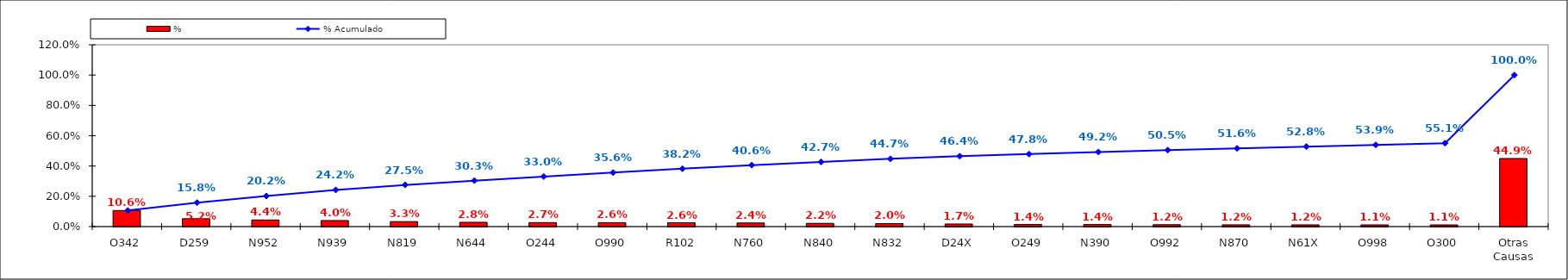
| Category | % |
|---|---|
| O342 | 0.106 |
| D259 | 0.052 |
| N952 | 0.044 |
| N939 | 0.04 |
| N819 | 0.033 |
| N644 | 0.028 |
| O244 | 0.027 |
| O990 | 0.026 |
| R102 | 0.026 |
| N760 | 0.024 |
| N840 | 0.022 |
| N832 | 0.02 |
| D24X | 0.017 |
| O249 | 0.014 |
| N390 | 0.014 |
| O992 | 0.012 |
| N870 | 0.012 |
| N61X | 0.012 |
| O998 | 0.011 |
| O300 | 0.011 |
| Otras Causas | 0.449 |